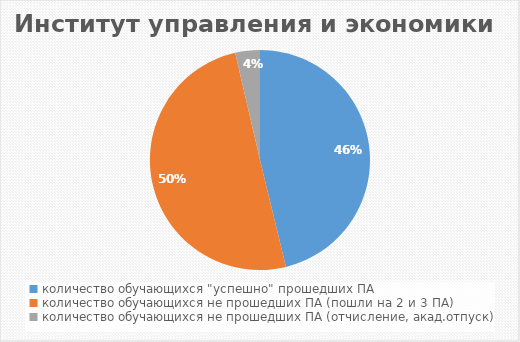
| Category | Институт управления и экономики |
|---|---|
| количество обучающихся "успешно" прошедших ПА | 408 |
| количество обучающихся не прошедших ПА (пошли на 2 и 3 ПА) | 443 |
| количество обучающихся не прошедших ПА (отчисление, акад.отпуск) | 32 |